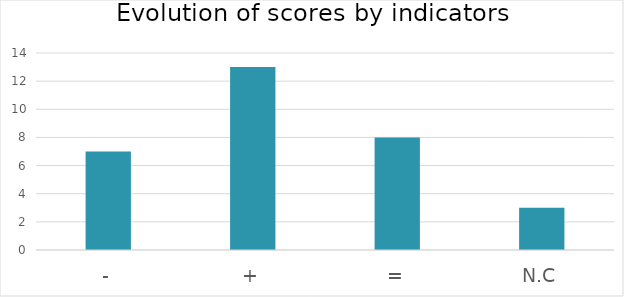
| Category | Evol |
|---|---|
| - | 7 |
| + | 13 |
| = | 8 |
| N.C | 3 |